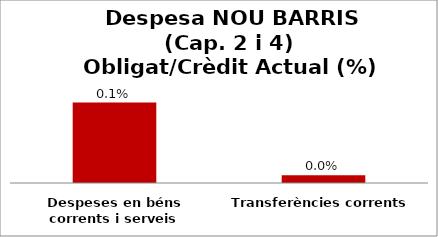
| Category | Series 0 |
|---|---|
| Despeses en béns corrents i serveis | 0.001 |
| Transferències corrents | 0 |